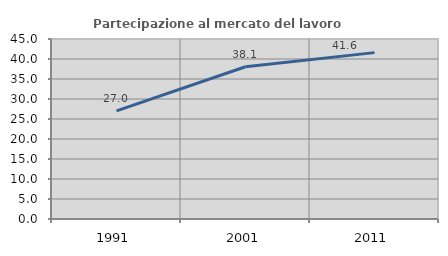
| Category | Partecipazione al mercato del lavoro  femminile |
|---|---|
| 1991.0 | 27.034 |
| 2001.0 | 38.051 |
| 2011.0 | 41.593 |